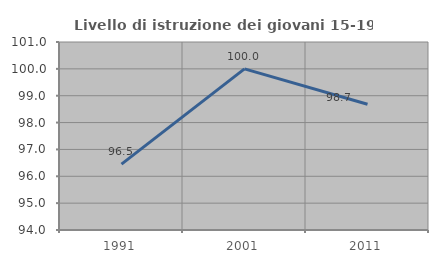
| Category | Livello di istruzione dei giovani 15-19 anni |
|---|---|
| 1991.0 | 96.454 |
| 2001.0 | 100 |
| 2011.0 | 98.684 |